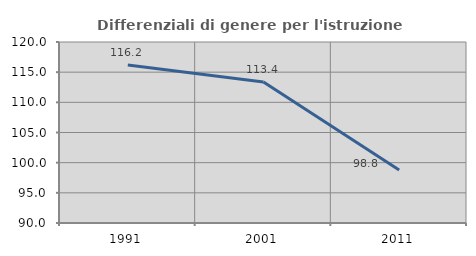
| Category | Differenziali di genere per l'istruzione superiore |
|---|---|
| 1991.0 | 116.172 |
| 2001.0 | 113.357 |
| 2011.0 | 98.78 |